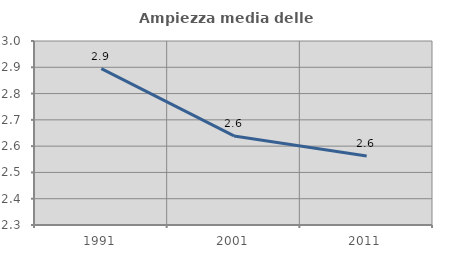
| Category | Ampiezza media delle famiglie |
|---|---|
| 1991.0 | 2.895 |
| 2001.0 | 2.639 |
| 2011.0 | 2.563 |